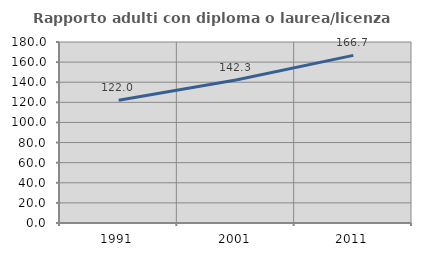
| Category | Rapporto adulti con diploma o laurea/licenza media  |
|---|---|
| 1991.0 | 122.006 |
| 2001.0 | 142.277 |
| 2011.0 | 166.714 |